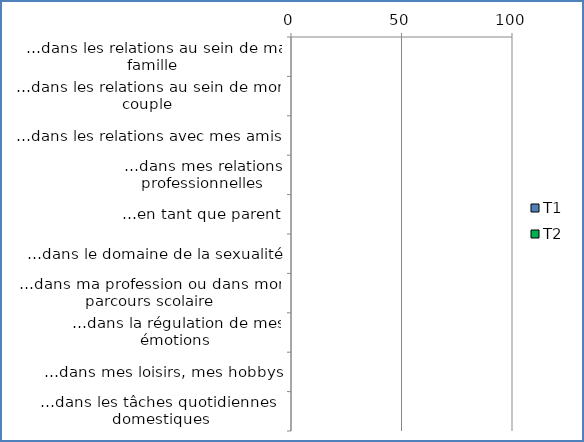
| Category | T1 | T2 |
|---|---|---|
| …dans les relations au sein de ma famille | 0 | 0 |
| …dans les relations au sein de mon couple | 0 | 0 |
| …dans les relations avec mes amis | 0 | 0 |
| …dans mes relations professionnelles | 0 | 0 |
| …en tant que parent | 0 | 0 |
| …dans le domaine de la sexualité | 0 | 0 |
| …dans ma profession ou dans mon parcours scolaire | 0 | 0 |
| …dans la régulation de mes émotions | 0 | 0 |
| …dans mes loisirs, mes hobbys | 0 | 0 |
| …dans les tâches quotidiennes / domestiques | 0 | 0 |